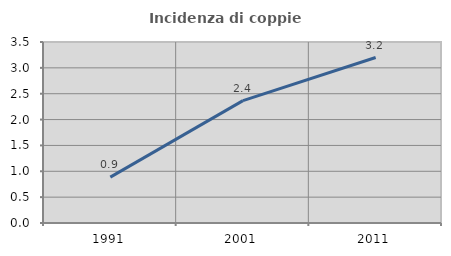
| Category | Incidenza di coppie miste |
|---|---|
| 1991.0 | 0.888 |
| 2001.0 | 2.367 |
| 2011.0 | 3.2 |